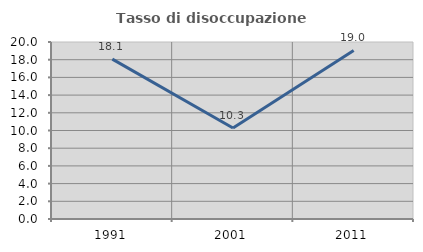
| Category | Tasso di disoccupazione giovanile  |
|---|---|
| 1991.0 | 18.065 |
| 2001.0 | 10.28 |
| 2011.0 | 19.048 |